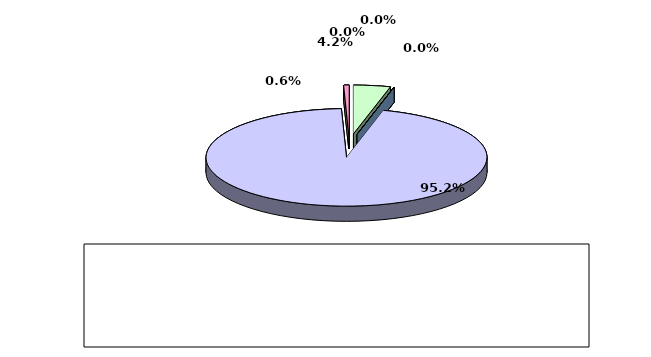
| Category | Series 0 |
|---|---|
| מזומנים ושווי מזומנים | 0.042 |
| אג"ח ממשלתיות סחירות | 0 |
| אג"ח קונצרני סחיר | 0 |
| ני"ע אחרים סחירים | 0.952 |
| פקדונות והלוואות | 0 |
| השקעות אחרות | 0.006 |